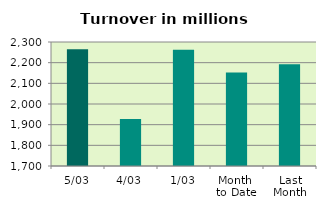
| Category | Series 0 |
|---|---|
| 5/03 | 2265.08 |
| 4/03 | 1927.995 |
| 1/03 | 2262.659 |
| Month 
to Date | 2151.912 |
| Last
Month | 2191.938 |